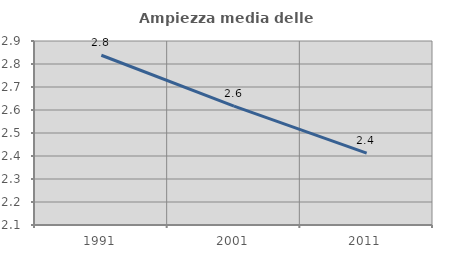
| Category | Ampiezza media delle famiglie |
|---|---|
| 1991.0 | 2.838 |
| 2001.0 | 2.617 |
| 2011.0 | 2.412 |